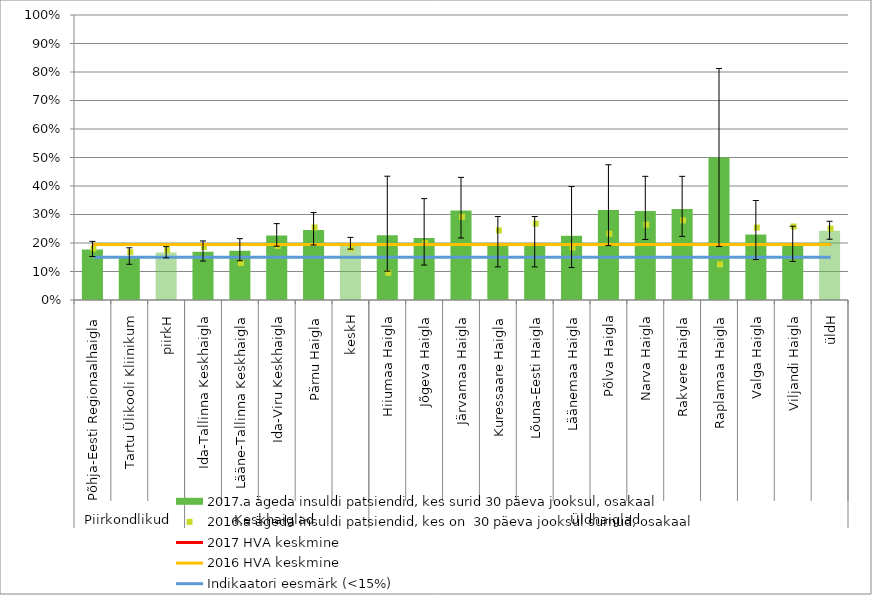
| Category | 2017.a ägeda insuldi patsiendid, kes surid 30 päeva jooksul, osakaal |
|---|---|
| 0 | 0.178 |
| 1 | 0.152 |
| 2 | 0.167 |
| 3 | 0.169 |
| 4 | 0.173 |
| 5 | 0.226 |
| 6 | 0.245 |
| 7 | 0.198 |
| 8 | 0.227 |
| 9 | 0.217 |
| 10 | 0.314 |
| 11 | 0.189 |
| 12 | 0.189 |
| 13 | 0.226 |
| 14 | 0.316 |
| 15 | 0.312 |
| 16 | 0.319 |
| 17 | 0.5 |
| 18 | 0.23 |
| 19 | 0.19 |
| 20 | 0.243 |